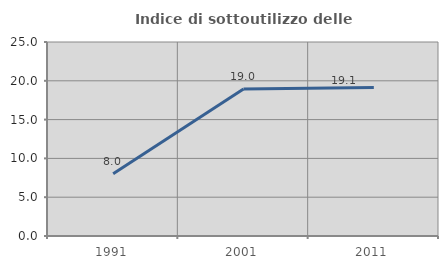
| Category | Indice di sottoutilizzo delle abitazioni  |
|---|---|
| 1991.0 | 8.029 |
| 2001.0 | 18.954 |
| 2011.0 | 19.149 |